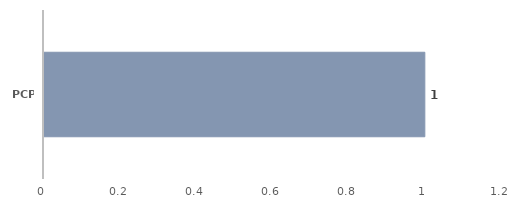
| Category | Total |
|---|---|
| PCP | 1 |